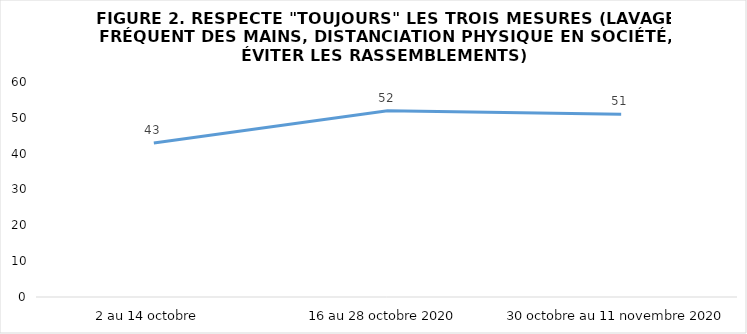
| Category | Series 0 |
|---|---|
| 2 au 14 octobre  | 43 |
| 16 au 28 octobre 2020 | 52 |
| 30 octobre au 11 novembre 2020 | 51 |